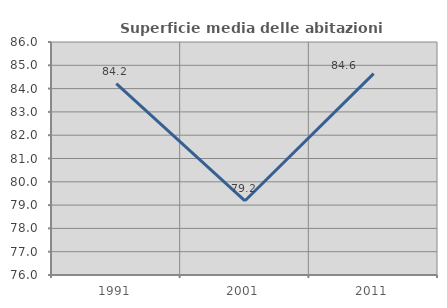
| Category | Superficie media delle abitazioni occupate |
|---|---|
| 1991.0 | 84.209 |
| 2001.0 | 79.185 |
| 2011.0 | 84.644 |